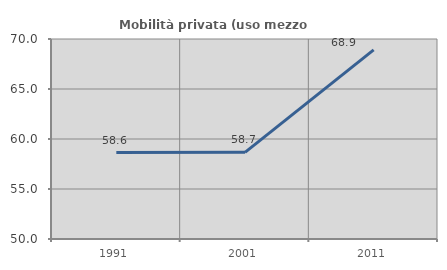
| Category | Mobilità privata (uso mezzo privato) |
|---|---|
| 1991.0 | 58.639 |
| 2001.0 | 58.667 |
| 2011.0 | 68.908 |